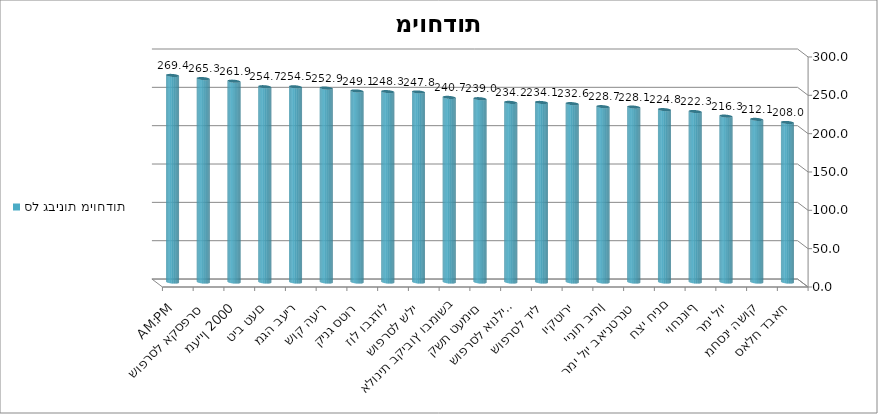
| Category | סל גבינות מיוחדות |
|---|---|
| סאלח דבאח | 208.03 |
| מחסני השוק | 212.05 |
| רמי לוי | 216.3 |
| יוחננוף | 222.28 |
| חצי חינם | 224.8 |
| רמי לוי באינטרנט | 228.1 |
| יינות ביתן | 228.65 |
| ויקטורי | 232.6 |
| שופרסל דיל | 234.14 |
| שופרסל אונליין | 234.2 |
| קשת טעמים | 239.04 |
| אלונית בקיבוץ ובמושב | 240.74 |
| שופרסל שלי | 247.8 |
| זול ובגדול | 248.27 |
| קינג סטור | 249.1 |
| שוק העיר | 252.87 |
| מגה בעיר | 254.53 |
| טיב טעם | 254.68 |
| מעיין 2000 | 261.85 |
| שופרסל אקספרס | 265.27 |
| AM:PM | 269.36 |